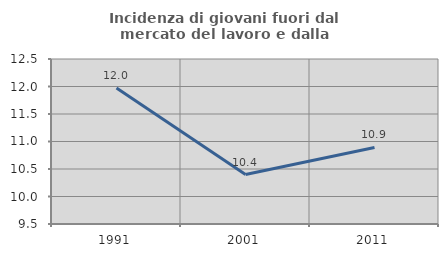
| Category | Incidenza di giovani fuori dal mercato del lavoro e dalla formazione  |
|---|---|
| 1991.0 | 11.972 |
| 2001.0 | 10.4 |
| 2011.0 | 10.891 |